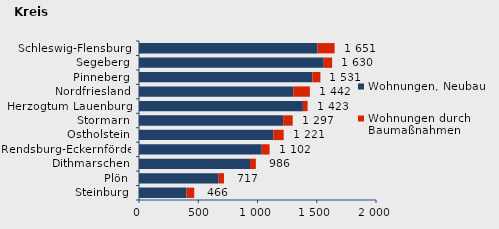
| Category | Wohnungen, Neubau | Wohnungen durch Baumaßnahmen | Series 2 |
|---|---|---|---|
| Steinburg | 401 | 65 | 466 |
| Plön | 672 | 45 | 717 |
| Dithmarschen | 937 | 49 | 986 |
| Rendsburg-Eckernförde | 1036 | 66 | 1102 |
| Ostholstein | 1135 | 86 | 1221 |
| Stormarn | 1217 | 80 | 1297 |
| Herzogtum Lauenburg | 1383 | 40 | 1423 |
| Nordfriesland | 1302 | 140 | 1442 |
| Pinneberg | 1463 | 68 | 1531 |
| Segeberg | 1559 | 71 | 1630 |
| Schleswig-Flensburg | 1507 | 144 | 1651 |